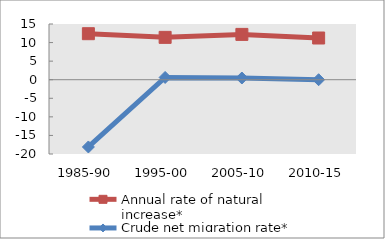
| Category | Annual rate of natural increase* | Crude net migration rate* |
|---|---|---|
| 1985-90 | 12.389 | -18.105 |
| 1995-00 | 11.403 | 0.611 |
| 2005-10 | 12.202 | 0.461 |
| 2010-15 | 11.228 | 0 |